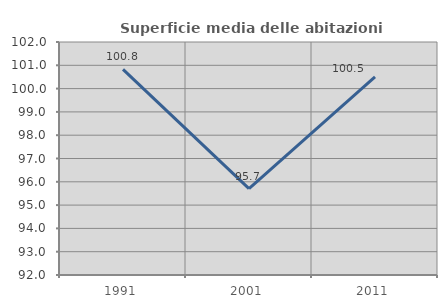
| Category | Superficie media delle abitazioni occupate |
|---|---|
| 1991.0 | 100.828 |
| 2001.0 | 95.708 |
| 2011.0 | 100.5 |